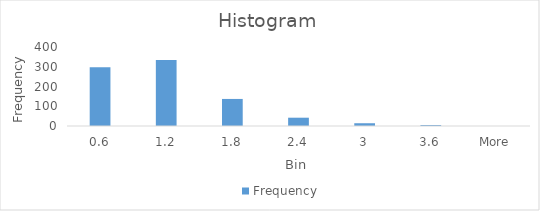
| Category | Frequency |
|---|---|
| 0.6 | 297 |
| 1.2 | 334 |
| 1.8 | 137 |
| 2.4 | 42 |
| 3 | 14 |
| 3.6 | 5 |
| More | 0 |